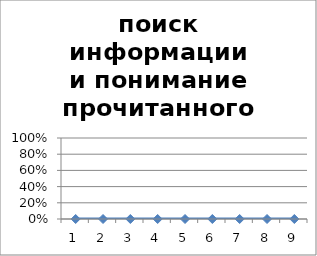
| Category | поиск информации и понимание прочитанного |
|---|---|
| 1.0 | 0 |
| 2.0 | 0 |
| 3.0 | 0 |
| 4.0 | 0 |
| 5.0 | 0 |
| 6.0 | 0 |
| 7.0 | 0 |
| 8.0 | 0 |
| 9.0 | 0 |